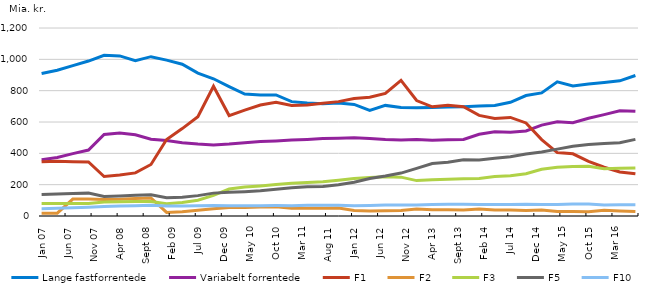
| Category | Lange fastforrentede | Variabelt forrentede | F1 | F2 | F3 | F5 | F10 |
|---|---|---|---|---|---|---|---|
| 2007-01-01 | 909 | 359 | 347 | 18 | 80 | 137 | 46 |
| 2007-04-01 | 930 | 374 | 350 | 18 | 80 | 140 | 49 |
| 2007-07-01 | 960 | 398 | 347 | 108 | 80 | 143 | 53 |
| 2007-10-01 | 989 | 421 | 345 | 109 | 80 | 146 | 56 |
| 2008-01-01 | 1026 | 520 | 252 | 105 | 89 | 124 | 61 |
| 2008-04-01 | 1022 | 530 | 261 | 107 | 91 | 128 | 64 |
| 2008-07-01 | 992 | 518 | 275 | 112 | 92 | 132 | 66 |
| 2008-10-01 | 1017 | 490 | 329 | 115 | 92 | 135 | 68 |
| 2009-01-01 | 995 | 482 | 488 | 23 | 79 | 116 | 64 |
| 2009-04-01 | 969 | 468 | 558 | 27 | 86 | 120 | 64 |
| 2009-07-01 | 912 | 459 | 634 | 37 | 101 | 130 | 66 |
| 2009-10-01 | 876 | 454 | 828 | 47 | 132 | 146 | 67 |
| 2010-01-01 | 826 | 459 | 641 | 54 | 172 | 151 | 65 |
| 2010-04-01 | 778 | 468 | 676 | 55 | 185 | 155 | 65 |
| 2010-07-01 | 772 | 475 | 708 | 57 | 192 | 161 | 66 |
| 2010-10-01 | 773 | 479 | 726 | 59 | 201 | 171 | 67 |
| 2011-01-01 | 730 | 485 | 706 | 50 | 209 | 180 | 66 |
| 2011-04-01 | 722 | 489 | 709 | 50 | 214 | 186 | 68 |
| 2011-07-01 | 717 | 495 | 719 | 50 | 218 | 188 | 69 |
| 2011-10-01 | 721 | 496 | 730 | 51 | 228 | 199 | 69 |
| 2012-01-01 | 712 | 499 | 750 | 35 | 240 | 215 | 66 |
| 2012-04-01 | 674 | 494 | 758 | 32 | 246 | 239 | 67 |
| 2012-07-01 | 706 | 488 | 782 | 33 | 250 | 255 | 70 |
| 2012-10-01 | 692 | 485 | 866 | 35 | 248 | 274 | 71 |
| 2013-01-01 | 691 | 488 | 737 | 44 | 226 | 304 | 71 |
| 2013-04-01 | 693 | 484 | 697 | 40 | 232 | 335 | 74 |
| 2013-07-01 | 696 | 486 | 707 | 40 | 235 | 343 | 75 |
| 2013-10-01 | 698 | 489 | 697 | 39 | 237 | 359 | 75 |
| 2014-01-01 | 702 | 522 | 642 | 44 | 239 | 358 | 73 |
| 2014-04-01 | 705 | 538 | 622 | 39 | 252 | 369 | 73 |
| 2014-07-01 | 726 | 535 | 629 | 38 | 257 | 378 | 74 |
| 2014-10-01 | 769 | 543 | 594 | 35 | 270 | 396 | 75 |
| 2015-01-01 | 786 | 580 | 488 | 39 | 298 | 409 | 73 |
| 2015-04-01 | 856 | 602 | 405 | 28 | 311 | 427 | 74 |
| 2015-07-01 | 830 | 596 | 397 | 28 | 316 | 445 | 76 |
| 2015-10-01 | 843 | 624 | 349 | 27 | 318 | 457 | 76 |
| 2016-01-01 | 852 | 647 | 311 | 36 | 302 | 462 | 71 |
| 2016-04-01 | 863 | 672 | 281 | 32 | 304 | 468 | 72 |
| 2016-07-01 | 897 | 668 | 269 | 29 | 307 | 489 | 72 |